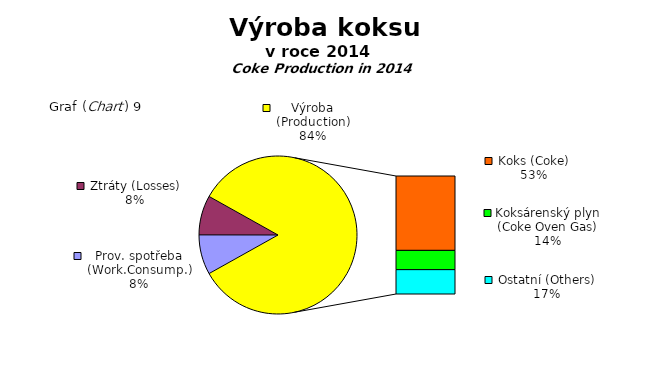
| Category | Series 0 |
|---|---|
| Prov. spotřeba (Work.Consump.) | 11133916 |
| Ztráty (Losses) | 11080678 |
| Koks (Coke) | 72251069 |
| Koksárenský plyn (Coke Oven Gas) | 18699134 |
| Ostatní (Others) | 23659121 |